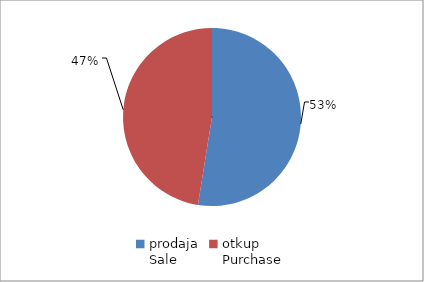
| Category | Series 0 |
|---|---|
| prodaja
Sale | 13763583 |
| otkup
Purchase | 12436660.5 |